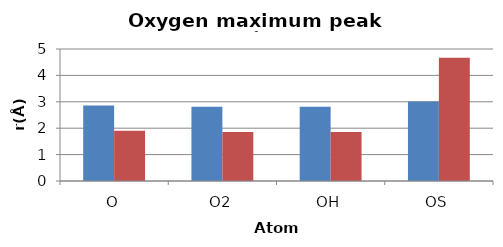
| Category | OW | HW |
|---|---|---|
| O | 2.86 | 1.906 |
| O2 | 2.809 | 1.856 |
| OH | 2.809 | 1.856 |
| OS | 3.01 | 4.666 |